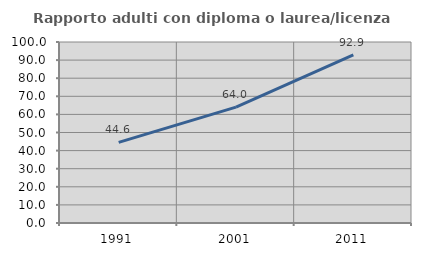
| Category | Rapporto adulti con diploma o laurea/licenza media  |
|---|---|
| 1991.0 | 44.575 |
| 2001.0 | 64.017 |
| 2011.0 | 92.857 |